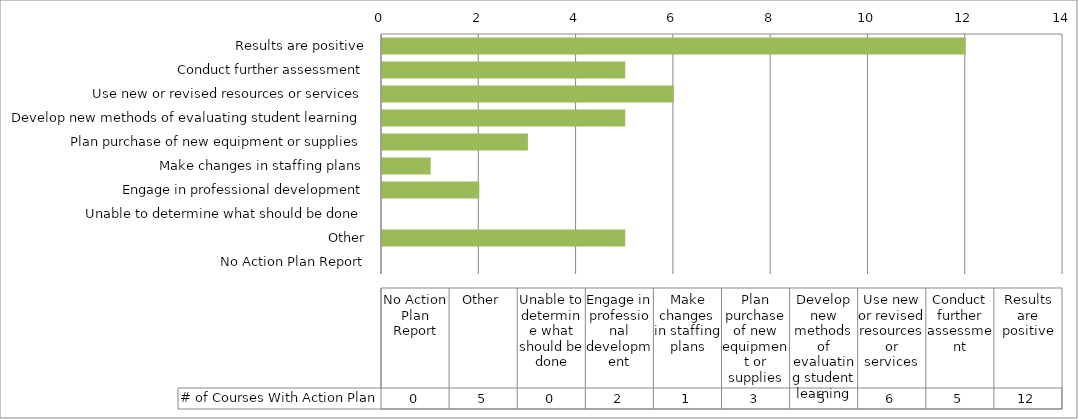
| Category | # of Courses With Action Plan |
|---|---|
| Results are positive | 12 |
| Conduct further assessment | 5 |
| Use new or revised resources or services | 6 |
| Develop new methods of evaluating student learning | 5 |
| Plan purchase of new equipment or supplies | 3 |
| Make changes in staffing plans | 1 |
| Engage in professional development | 2 |
| Unable to determine what should be done | 0 |
| Other | 5 |
| No Action Plan Report | 0 |